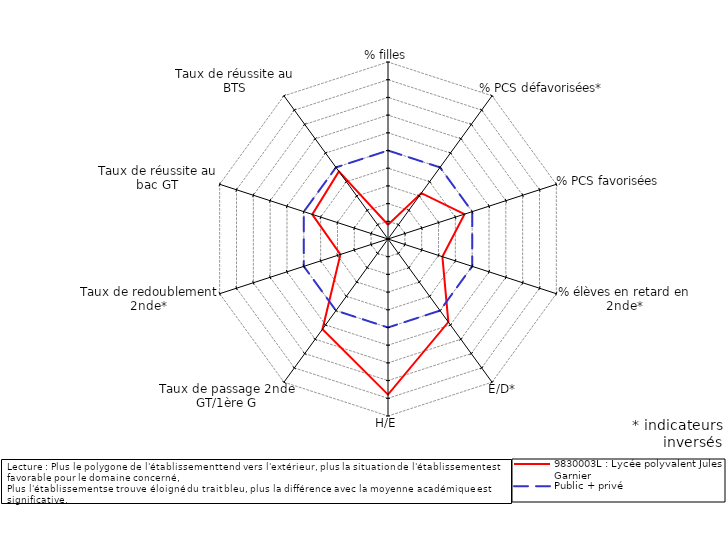
| Category | 9830003L : Lycée polyvalent Jules Garnier | Public + privé |
|---|---|---|
| % filles | -4.196 | 0 |
| % PCS défavorisées* | -1.795 | 0 |
| % PCS favorisées | -0.455 | 0 |
| % élèves en retard en 2nde* | -1.769 | 0 |
| E/D* | 0.8 | 0 |
| H/E | 3.792 | 0 |
| Taux de passage 2nde GT/1ère G | 1.295 | 0 |
| Taux de redoublement 2nde* | -2.172 | 0 |
| Taux de réussite au bac GT | -0.5 | 0 |
| Taux de réussite au BTS | -0.278 | 0 |